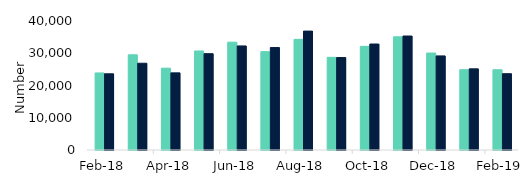
| Category | First-time
buyers | Home movers |
|---|---|---|
| 2018-02-01 | 23890 | 23630 |
| 2018-03-01 | 29510 | 26900 |
| 2018-04-01 | 25370 | 23920 |
| 2018-05-01 | 30710 | 29870 |
| 2018-06-01 | 33430 | 32270 |
| 2018-07-01 | 30490 | 31770 |
| 2018-08-01 | 34310 | 36870 |
| 2018-09-01 | 28730 | 28670 |
| 2018-10-01 | 32140 | 32860 |
| 2018-11-01 | 35090 | 35340 |
| 2018-12-01 | 30060 | 29180 |
| 2019-01-01 | 24890 | 25170 |
| 2019-02-01 | 24880 | 23660 |